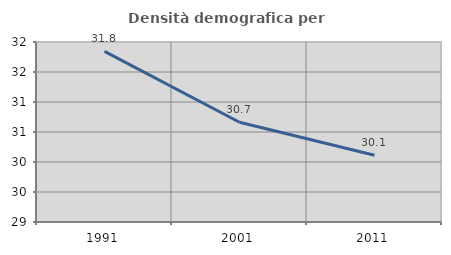
| Category | Densità demografica |
|---|---|
| 1991.0 | 31.843 |
| 2001.0 | 30.662 |
| 2011.0 | 30.113 |